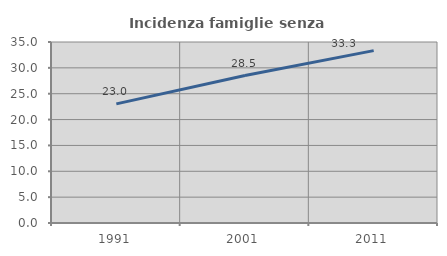
| Category | Incidenza famiglie senza nuclei |
|---|---|
| 1991.0 | 23.034 |
| 2001.0 | 28.517 |
| 2011.0 | 33.333 |